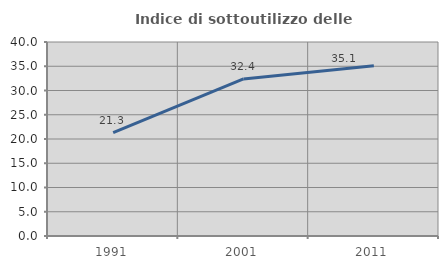
| Category | Indice di sottoutilizzo delle abitazioni  |
|---|---|
| 1991.0 | 21.302 |
| 2001.0 | 32.39 |
| 2011.0 | 35.088 |